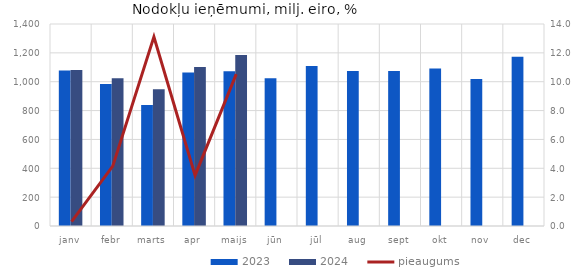
| Category | 2023 | 2024 |
|---|---|---|
| janv | 1077.163 | 1080.454 |
| febr | 983.504 | 1024.284 |
| marts | 838.446 | 948.367 |
| apr | 1063.867 | 1101.148 |
| maijs | 1071.795 | 1184.612 |
| jūn | 1023.215 | 0 |
| jūl | 1108.668 | 0 |
| aug | 1074.853 | 0 |
| sept | 1074.819 | 0 |
| okt | 1092.402 | 0 |
| nov | 1019.074 | 0 |
| dec | 1172.609 | 0 |